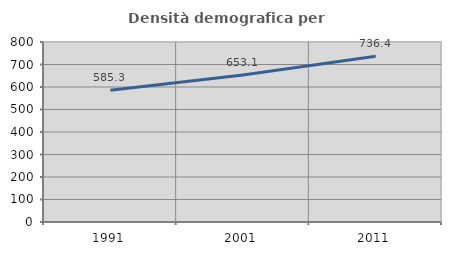
| Category | Densità demografica |
|---|---|
| 1991.0 | 585.286 |
| 2001.0 | 653.096 |
| 2011.0 | 736.385 |